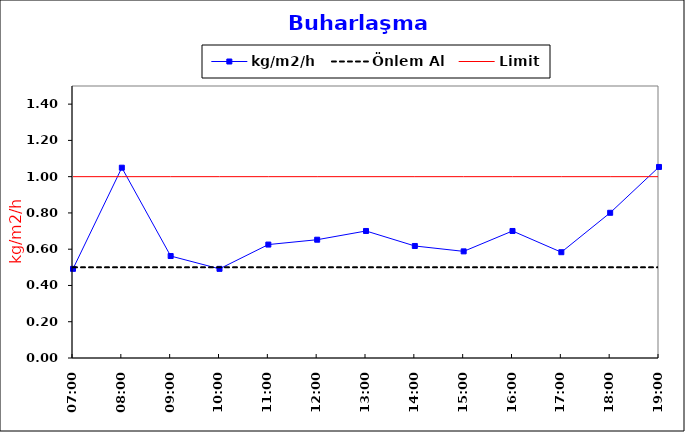
| Category | kg/m2/h | Önlem Al | Limit |
|---|---|---|---|
| 0.2916666666666667 | 0.492 | 0.5 | 1 |
| 0.333333333333333 | 1.049 | 0.5 | 1 |
| 0.374999999999999 | 0.562 | 0.5 | 1 |
| 0.416666666666666 | 0.492 | 0.5 | 1 |
| 0.458333333333332 | 0.626 | 0.5 | 1 |
| 0.499999999999998 | 0.652 | 0.5 | 1 |
| 0.541666666666665 | 0.701 | 0.5 | 1 |
| 0.583333333333331 | 0.618 | 0.5 | 1 |
| 0.624999999999997 | 0.588 | 0.5 | 1 |
| 0.666666666666664 | 0.701 | 0.5 | 1 |
| 0.70833333333333 | 0.583 | 0.5 | 1 |
| 0.749999999999996 | 0.801 | 0.5 | 1 |
| 0.791666666666663 | 1.054 | 0.5 | 1 |